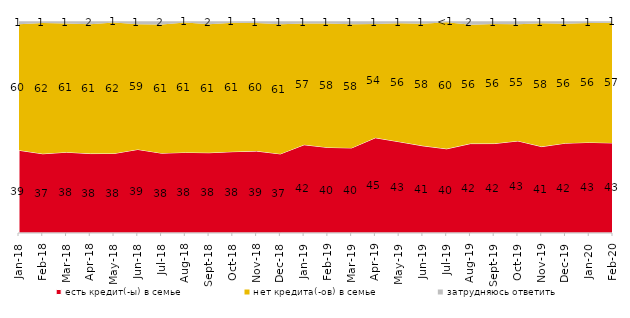
| Category | есть кредит(-ы) в семье | нет кредита(-ов) в семье | затрудняюсь ответить |
|---|---|---|---|
| 2018-01-01 | 39.05 | 59.5 | 1.45 |
| 2018-02-01 | 37.4 | 61.8 | 0.8 |
| 2018-03-01 | 38.15 | 60.8 | 1.05 |
| 2018-04-01 | 37.5 | 61 | 1.5 |
| 2018-05-01 | 37.55 | 61.8 | 0.65 |
| 2018-06-01 | 39.45 | 59.15 | 1.35 |
| 2018-07-01 | 37.7 | 60.7 | 1.6 |
| 2018-08-01 | 38.05 | 61.3 | 0.65 |
| 2018-09-01 | 37.9 | 60.6 | 1.5 |
| 2018-10-01 | 38.4 | 60.85 | 0.75 |
| 2018-11-01 | 38.673 | 60.479 | 0.848 |
| 2018-12-01 | 37.35 | 61.2 | 1.45 |
| 2019-01-01 | 41.65 | 57.3 | 1.05 |
| 2019-02-01 | 40.4 | 58.45 | 1.15 |
| 2019-03-01 | 40.179 | 58.379 | 1.442 |
| 2019-04-01 | 44.95 | 53.762 | 1.287 |
| 2019-05-01 | 43.091 | 55.968 | 0.941 |
| 2019-06-01 | 41.147 | 57.656 | 1.197 |
| 2019-07-01 | 39.752 | 59.752 | 0.495 |
| 2019-08-01 | 42.208 | 56.144 | 1.648 |
| 2019-09-01 | 42.228 | 56.485 | 1.287 |
| 2019-10-01 | 43.465 | 55.099 | 1.436 |
| 2019-11-01 | 40.792 | 58.218 | 0.99 |
| 2019-12-01 | 42.426 | 56.386 | 1.188 |
| 2020-01-01 | 42.772 | 56.337 | 0.891 |
| 2020-02-01 | 42.525 | 56.782 | 0.693 |